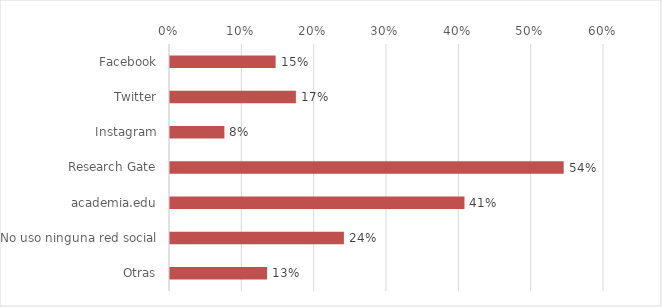
| Category | Series 1 |
|---|---|
| Facebook | 0.146 |
| Twitter | 0.174 |
| Instagram | 0.075 |
| Research Gate | 0.544 |
| academia.edu | 0.407 |
| No uso ninguna red social | 0.24 |
| Otras | 0.134 |